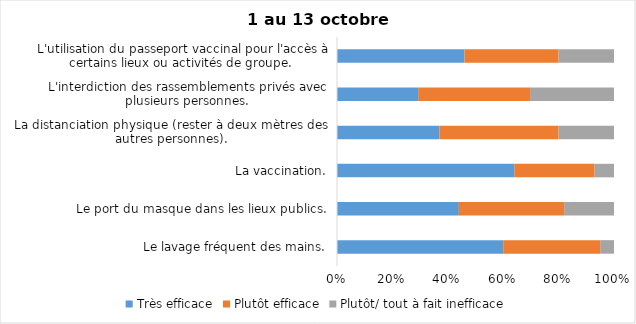
| Category | Très efficace | Plutôt efficace | Plutôt/ tout à fait inefficace |
|---|---|---|---|
| Le lavage fréquent des mains. | 60 | 35 | 5 |
| Le port du masque dans les lieux publics. | 44 | 38 | 18 |
| La vaccination. | 64 | 29 | 7 |
| La distanciation physique (rester à deux mètres des autres personnes). | 37 | 43 | 20 |
| L'interdiction des rassemblements privés avec plusieurs personnes. | 29 | 40 | 30 |
| L'utilisation du passeport vaccinal pour l'accès à certains lieux ou activités de groupe.  | 46 | 34 | 20 |